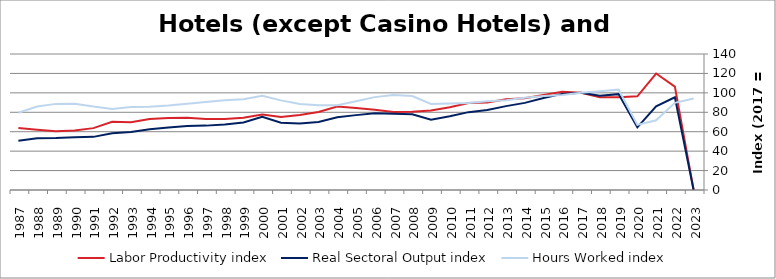
| Category | Labor Productivity index | Real Sectoral Output index | Hours Worked index |
|---|---|---|---|
| 2023.0 | 0 | 0 | 94.13 |
| 2022.0 | 106.435 | 95.473 | 89.701 |
| 2021.0 | 119.898 | 86.098 | 71.81 |
| 2020.0 | 96.391 | 64.54 | 66.957 |
| 2019.0 | 95.519 | 98.687 | 103.317 |
| 2018.0 | 95.507 | 96.979 | 101.542 |
| 2017.0 | 100 | 100 | 100 |
| 2016.0 | 101.111 | 98.949 | 97.862 |
| 2015.0 | 97.76 | 94.64 | 96.809 |
| 2014.0 | 94.478 | 89.694 | 94.936 |
| 2013.0 | 93.499 | 86.327 | 92.33 |
| 2012.0 | 90.102 | 82.425 | 91.48 |
| 2011.0 | 89.551 | 80.154 | 89.507 |
| 2010.0 | 85.252 | 75.868 | 88.993 |
| 2009.0 | 81.775 | 72.429 | 88.571 |
| 2008.0 | 80.546 | 77.924 | 96.744 |
| 2007.0 | 80.268 | 78.549 | 97.858 |
| 2006.0 | 82.591 | 78.967 | 95.612 |
| 2005.0 | 84.316 | 77.077 | 91.415 |
| 2004.0 | 85.9 | 74.98 | 87.288 |
| 2003.0 | 80.275 | 69.941 | 87.128 |
| 2002.0 | 77.24 | 68.337 | 88.474 |
| 2001.0 | 75.098 | 69.28 | 92.253 |
| 2000.0 | 77.684 | 75.311 | 96.945 |
| 1999.0 | 74.471 | 69.493 | 93.316 |
| 1998.0 | 73.046 | 67.534 | 92.454 |
| 1997.0 | 73.192 | 66.269 | 90.541 |
| 1996.0 | 74.343 | 65.959 | 88.723 |
| 1995.0 | 74.04 | 64.337 | 86.895 |
| 1994.0 | 73.11 | 62.629 | 85.664 |
| 1993.0 | 69.779 | 59.624 | 85.447 |
| 1992.0 | 70.238 | 58.504 | 83.294 |
| 1991.0 | 63.695 | 54.691 | 85.865 |
| 1990.0 | 61.218 | 54.407 | 88.875 |
| 1989.0 | 60.504 | 53.64 | 88.654 |
| 1988.0 | 62.057 | 53.364 | 85.992 |
| 1987.0 | 63.731 | 50.704 | 79.559 |